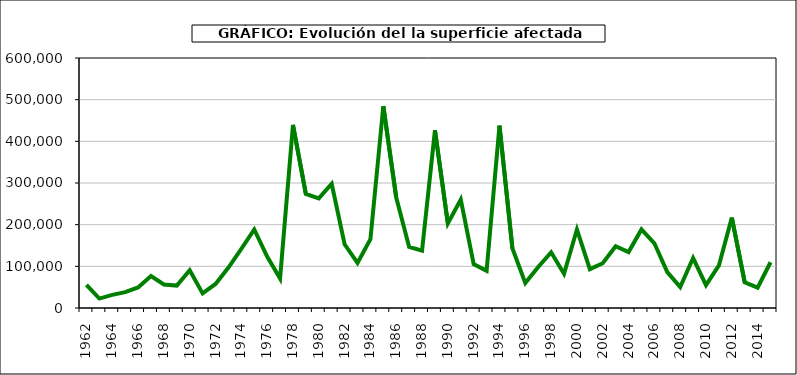
| Category | Series 0 |
|---|---|
| 1962.0 | 55482 |
| 1963.0 | 22679 |
| 1964.0 | 31398 |
| 1965.0 | 38018 |
| 1966.0 | 49354 |
| 1967.0 | 76575 |
| 1968.0 | 56497 |
| 1969.0 | 53739 |
| 1970.0 | 90547 |
| 1971.0 | 35044 |
| 1972.0 | 57753 |
| 1973.0 | 96989 |
| 1974.0 | 142115 |
| 1975.0 | 188595 |
| 1976.0 | 123577 |
| 1977.0 | 70749 |
| 1978.0 | 439526 |
| 1979.0 | 273567 |
| 1980.0 | 263017 |
| 1981.0 | 298288 |
| 1982.0 | 152903 |
| 1983.0 | 108100 |
| 1984.0 | 165119 |
| 1985.0 | 484476 |
| 1986.0 | 264887 |
| 1987.0 | 146662 |
| 1988.0 | 137734 |
| 1989.0 | 426693 |
| 1990.0 | 203032 |
| 1991.0 | 260318 |
| 1992.0 | 105277 |
| 1993.0 | 89267 |
| 1994.0 | 437635 |
| 1995.0 | 143484 |
| 1996.0 | 59814 |
| 1997.0 | 98503 |
| 1998.0 | 133643 |
| 1999.0 | 82217 |
| 2000.0 | 188586 |
| 2001.0 | 93297 |
| 2002.0 | 107464 |
| 2003.0 | 148172 |
| 2004.0 | 134193 |
| 2005.0 | 188672 |
| 2006.0 | 155363 |
| 2007.0 | 86113 |
| 2008.0 | 50321 |
| 2009.0 | 119892 |
| 2010.0 | 54770 |
| 2011.0 | 102162 |
| 2012.0 | 216894 |
| 2013.0 | 61690.61 |
| 2014.0 | 48717.83 |
| 2015.0 | 109782 |